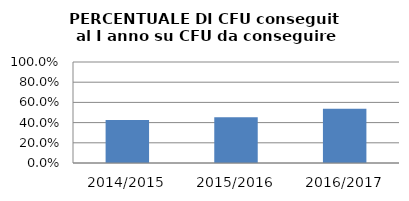
| Category | 2014/2015 2015/2016 2016/2017 |
|---|---|
| 2014/2015 | 0.425 |
| 2015/2016 | 0.453 |
| 2016/2017 | 0.537 |